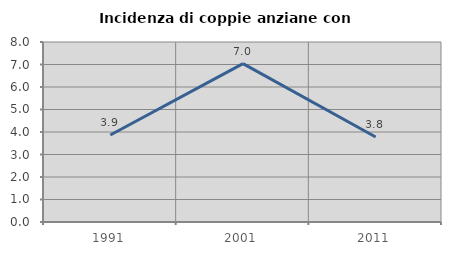
| Category | Incidenza di coppie anziane con figli |
|---|---|
| 1991.0 | 3.867 |
| 2001.0 | 7.041 |
| 2011.0 | 3.776 |